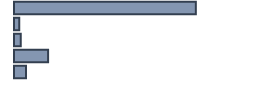
| Category | Percentatge |
|---|---|
| 0 | 75.766 |
| 1 | 2.228 |
| 2 | 2.786 |
| 3 | 14.206 |
| 4 | 5.014 |